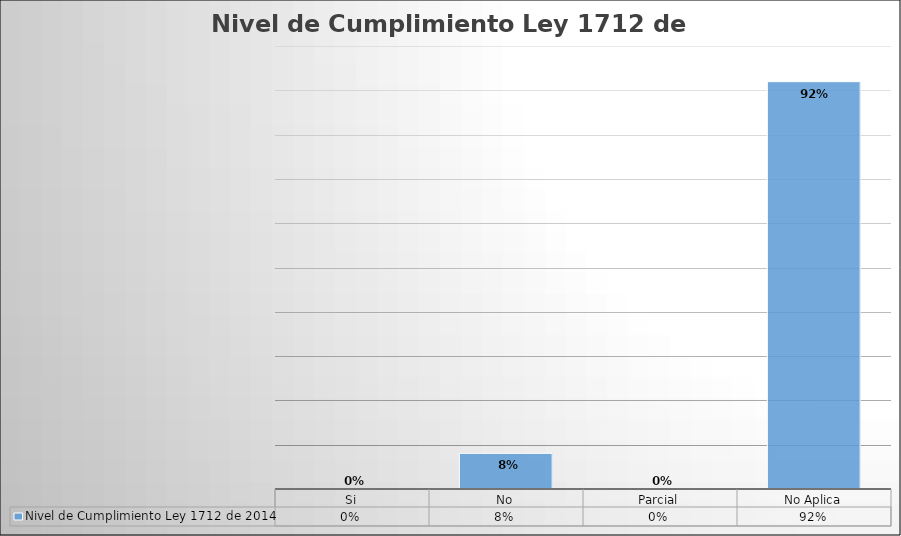
| Category | Nivel de Cumplimiento Ley 1712 de 2014 |
|---|---|
| Si | 0 |
| No | 0.08 |
| Parcial | 0 |
| No Aplica | 0.92 |